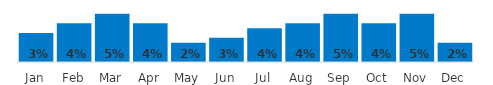
| Category | Employee Turnover Rate |
|---|---|
| Jan | 0.03 |
| Feb | 0.04 |
| Mar | 0.05 |
| Apr | 0.04 |
| May | 0.02 |
| Jun | 0.025 |
| Jul | 0.035 |
| Aug | 0.04 |
| Sep | 0.05 |
| Oct | 0.04 |
| Nov | 0.05 |
| Dec | 0.02 |